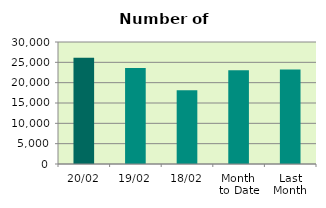
| Category | Series 0 |
|---|---|
| 20/02 | 26098 |
| 19/02 | 23610 |
| 18/02 | 18122 |
| Month 
to Date | 23031.571 |
| Last
Month | 23217.273 |